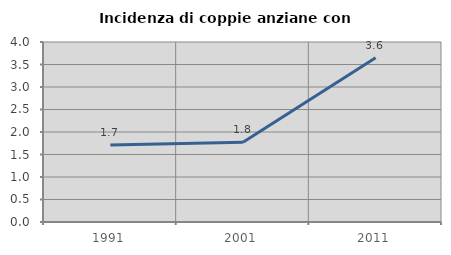
| Category | Incidenza di coppie anziane con figli |
|---|---|
| 1991.0 | 1.711 |
| 2001.0 | 1.772 |
| 2011.0 | 3.65 |